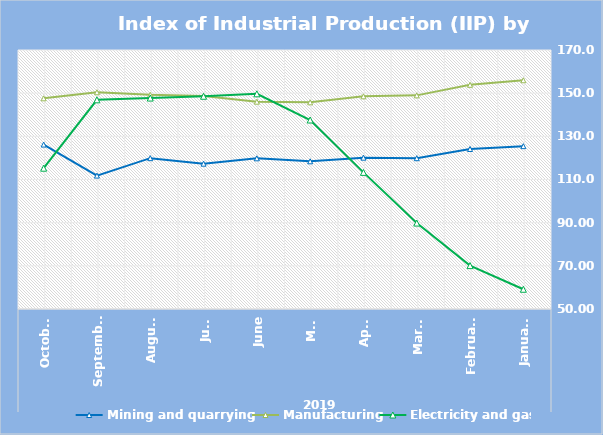
| Category | Mining and quarrying   | Manufacturing | Electricity and gas |
|---|---|---|---|
| 0 | 125.45 | 155.98 | 59.15 |
| 1 | 124.14 | 153.87 | 70.1 |
| 2 | 119.87 | 148.98 | 89.82 |
| 3 | 120.11 | 148.54 | 113.29 |
| 4 | 118.43 | 145.76 | 137.57 |
| 5 | 119.81 | 146.05 | 149.7 |
| 6 | 117.33 | 148.68 | 148.56 |
| 7 | 119.89 | 149.23 | 147.74 |
| 8 | 111.81 | 150.42 | 146.92 |
| 9 | 126.188 | 147.61 | 115.237 |